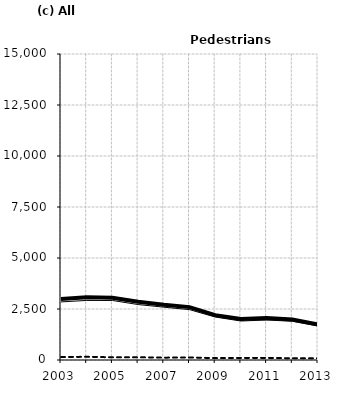
| Category | Built-up | Non built-up | Total |
|---|---|---|---|
| 2003.0 | 2847 | 143 | 2990 |
| 2004.0 | 2921 | 157 | 3078 |
| 2005.0 | 2918 | 133 | 3051 |
| 2006.0 | 2719 | 134 | 2853 |
| 2007.0 | 2589 | 115 | 2704 |
| 2008.0 | 2469 | 124 | 2593 |
| 2009.0 | 2107 | 92 | 2199 |
| 2010.0 | 1911 | 102 | 2013 |
| 2011.0 | 1961 | 103 | 2064 |
| 2012.0 | 1899 | 87 | 1986 |
| 2013.0 | 1665 | 82 | 1747 |